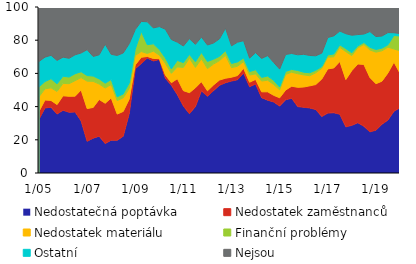
| Category | Nedostatečná poptávka | Nedostatek zaměstnanců | Nedostatek materiálu | Finanční problémy | Ostatní | Nejsou |
|---|---|---|---|---|---|---|
|  1/05 | 32.4 | 4.7 | 8.8 | 6 | 15.3 | 32.8 |
| 4 | 39.2 | 4.8 | 6.7 | 4.4 | 14.7 | 30.2 |
| 7 | 39.6 | 4.1 | 7.6 | 5.5 | 14.1 | 29.1 |
| 10 | 35.5 | 5.7 | 7.9 | 4.6 | 14.1 | 32.2 |
|  1/06 | 37.8 | 8.7 | 7.5 | 4.3 | 11.5 | 30.2 |
| 4 | 36.6 | 9.6 | 7.6 | 4 | 11.3 | 30.9 |
| 7 | 36.8 | 9.5 | 9.3 | 4.2 | 11.4 | 28.8 |
| 10 | 31.4 | 18.6 | 7.5 | 3.5 | 11.3 | 27.7 |
|  1/07 | 19.1 | 19.7 | 16.5 | 3.4 | 15.6 | 25.7 |
| 4 | 21 | 18.5 | 15.7 | 3.2 | 11.8 | 29.8 |
| 7 | 22.2 | 22.1 | 9.3 | 3.1 | 14.5 | 28.8 |
| 10 | 17.7 | 24.3 | 9.2 | 2.9 | 23.5 | 22.4 |
|  1/08 | 19.8 | 25.4 | 8.1 | 3 | 15.2 | 28.5 |
| 4 | 19.7 | 15.8 | 8.1 | 2.3 | 24.9 | 29.2 |
| 7 | 22.2 | 14.9 | 8.2 | 2.3 | 24.7 | 27.7 |
| 10 | 35.9 | 8.7 | 6.3 | 3.3 | 23.7 | 22.1 |
|  1/09 | 62.8 | 2.3 | 5.7 | 3.8 | 11.8 | 13.6 |
| 4 | 65.9 | 3.8 | 3.5 | 12.1 | 6 | 8.7 |
| 7 | 69.3 | 0.9 | 1.8 | 5.3 | 13.8 | 8.9 |
| 10 | 67.5 | 1.5 | 4.4 | 4.4 | 9.6 | 12.6 |
|  1/10 | 68.4 | 0.5 | 2.1 | 3.4 | 13.8 | 11.8 |
| 4 | 57.1 | 2 | 7 | 3.2 | 17.3 | 13.4 |
| 7 | 52.8 | 1.6 | 5.6 | 2.7 | 17.7 | 19.6 |
| 10 | 47.2 | 9.6 | 7.1 | 3.9 | 11 | 21.2 |
|  1/11 | 40.3 | 9.3 | 14 | 2.9 | 10 | 23.5 |
| 4 | 35.7 | 12.7 | 20.8 | 2.2 | 9.5 | 19.1 |
| 7 | 40 | 11.3 | 12.3 | 3.4 | 10.5 | 22.5 |
| 10 | 49.5 | 5.5 | 13.8 | 3.8 | 9.3 | 18.1 |
|  1/12 | 46.2 | 3.3 | 13.4 | 4.3 | 9.9 | 22.9 |
| 4 | 49.6 | 3.4 | 12.6 | 2.9 | 9.8 | 21.7 |
| 7 | 52.8 | 3.2 | 11.7 | 2.6 | 10.5 | 19.2 |
| 10 | 54.4 | 2.7 | 13.8 | 2.8 | 13.5 | 12.8 |
|  1/13 | 55.4 | 2.3 | 5.8 | 2.5 | 10.6 | 23.4 |
| 4 | 56.2 | 2.5 | 5.6 | 2.6 | 11.9 | 21.2 |
| 7 | 60.3 | 2.8 | 4 | 2.2 | 10.4 | 20.3 |
| 10 | 52 | 2.7 | 4.3 | 2.1 | 8.1 | 30.8 |
|  1/14 | 53.6 | 2.8 | 3.3 | 2.5 | 10.3 | 27.5 |
| 4 | 45.4 | 3.5 | 6.5 | 2.2 | 11.4 | 31 |
| 7 | 43.9 | 5 | 7 | 2.5 | 12.3 | 29.3 |
| 10 | 42.8 | 4 | 6.5 | 2.5 | 10.8 | 33.4 |
|  1/15 | 40.3 | 5 | 4.8 | 1.7 | 10.8 | 37.4 |
| 4 | 44.2 | 5.8 | 9.4 | 1.8 | 10.2 | 28.6 |
| 7 | 45 | 7.3 | 8.4 | 1.7 | 9.6 | 28 |
| 10 | 40 | 11.6 | 8.2 | 2 | 9.4 | 28.8 |
|  1/16 | 39.6 | 12.2 | 7.3 | 1.6 | 10.8 | 28.5 |
| 4 | 39.2 | 13.3 | 6.1 | 1.8 | 10.4 | 29.2 |
| 7 | 38.2 | 15.1 | 7.1 | 1.5 | 8.7 | 29.4 |
| 10 | 34 | 22.6 | 6.4 | 1.1 | 8.1 | 27.8 |
|  1/17 | 36.1 | 26.6 | 7.1 | 1.3 | 10.5 | 18.4 |
| 4 | 36.3 | 27 | 6.7 | 1.7 | 10.9 | 17.4 |
| 7 | 35.4 | 31.8 | 8.5 | 1.5 | 8.3 | 14.5 |
| 10 | 27.8 | 28.5 | 16.8 | 1.8 | 9 | 16.1 |
|  1/18 | 28.7 | 33 | 9 | 1.7 | 10.6 | 17 |
| 4 | 30.3 | 35.4 | 9.8 | 1.1 | 6.8 | 16.3 |
| 7 | 28.1 | 37.3 | 12 | 1.2 | 5.1 | 16.3 |
| 10 | 24.8 | 32.7 | 16.6 | 1.6 | 9.5 | 14.8 |
|  1/19 | 25.8 | 28 | 19 | 1.6 | 7.8 | 17.8 |
| 4 | 29.3 | 26 | 18.3 | 1.6 | 7.3 | 17.5 |
| 7 | 31.9 | 28.4 | 15.5 | 1.4 | 7.4 | 15.4 |
| 10 | 37.2 | 29.6 | 7.9 | 8.2 | 1.6 | 15.5 |
|  1/20 | 39.3 | 20.8 | 13.5 | 8.9 | 1.5 | 16 |